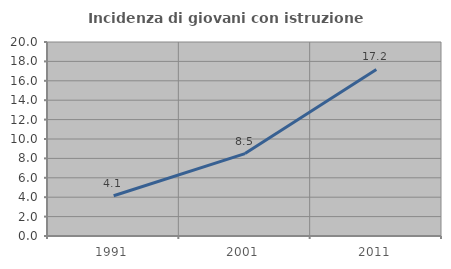
| Category | Incidenza di giovani con istruzione universitaria |
|---|---|
| 1991.0 | 4.145 |
| 2001.0 | 8.497 |
| 2011.0 | 17.167 |